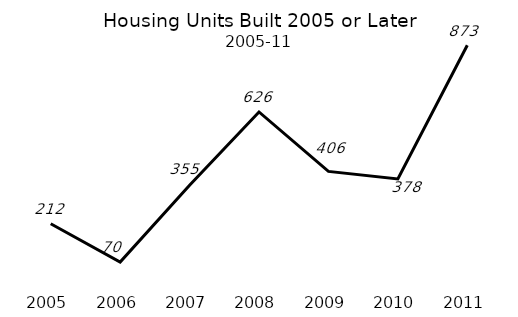
| Category | Series 0 |
|---|---|
| 2005.0 | 212 |
| 2006.0 | 70 |
| 2007.0 | 355 |
| 2008.0 | 626 |
| 2009.0 | 406 |
| 2010.0 | 378 |
| 2011.0 | 873 |